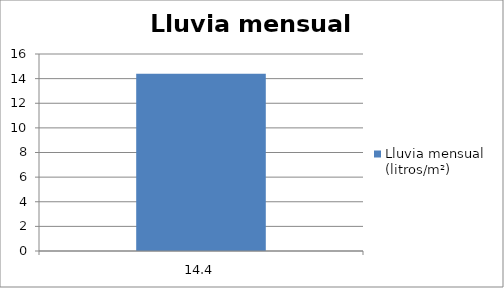
| Category | Lluvia mensual (litros/m²) |
|---|---|
| 14.399999999999999 | 14.4 |